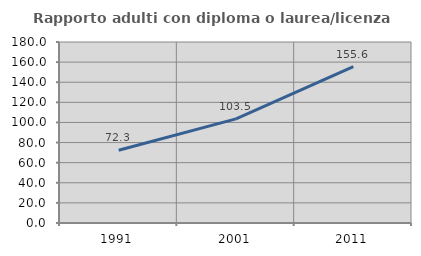
| Category | Rapporto adulti con diploma o laurea/licenza media  |
|---|---|
| 1991.0 | 72.29 |
| 2001.0 | 103.549 |
| 2011.0 | 155.587 |